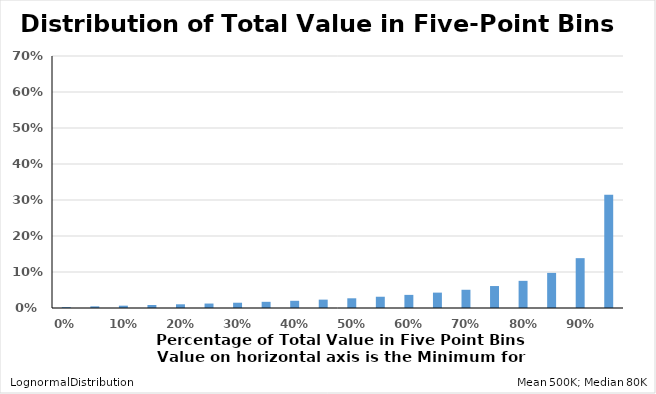
| Category | ValuePDF |
|---|---|
| 0.0 | 0.002 |
| 0.05 | 0.005 |
| 0.1 | 0.006 |
| 0.15 | 0.008 |
| 0.2 | 0.01 |
| 0.25 | 0.012 |
| 0.3 | 0.015 |
| 0.35 | 0.017 |
| 0.4 | 0.02 |
| 0.45 | 0.023 |
| 0.5 | 0.027 |
| 0.55 | 0.031 |
| 0.6 | 0.036 |
| 0.65 | 0.043 |
| 0.7 | 0.051 |
| 0.75 | 0.061 |
| 0.8 | 0.075 |
| 0.85 | 0.098 |
| 0.9 | 0.138 |
| 0.95 | 0.315 |